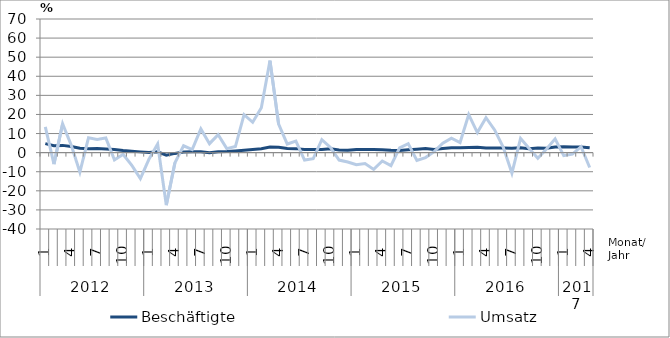
| Category | Beschäftigte | Umsatz |
|---|---|---|
| 0 | 4.7 | 13.5 |
| 1 | 3.6 | -6 |
| 2 | 3.8 | 15.1 |
| 3 | 3.2 | 3.9 |
| 4 | 2.3 | -10.2 |
| 5 | 2.1 | 7.8 |
| 6 | 2.2 | 6.9 |
| 7 | 1.9 | 7.7 |
| 8 | 1.7 | -3.8 |
| 9 | 1.1 | -0.9 |
| 10 | 0.7 | -6.6 |
| 11 | 0.4 | -13.6 |
| 12 | 0.1 | -3.4 |
| 13 | 0.4 | 4.5 |
| 14 | -1.3 | -27.5 |
| 15 | -0.4 | -5.3 |
| 16 | 0.3 | 3.6 |
| 17 | 0.4 | 1.6 |
| 18 | 0.4 | 12.4 |
| 19 | 0 | 4.7 |
| 20 | 0.5 | 9.4 |
| 21 | 0.6 | 2.1 |
| 22 | 0.9 | 3.2 |
| 23 | 1.2 | 19.9 |
| 24 | 1.6 | 15.9 |
| 25 | 2 | 23.5 |
| 26 | 2.9 | 48.2 |
| 27 | 2.8 | 14.9 |
| 28 | 2.2 | 4.5 |
| 29 | 2.1 | 6 |
| 30 | 1.6 | -3.9 |
| 31 | 1.6 | -3.2 |
| 32 | 1.6 | 6.8 |
| 33 | 2 | 2.7 |
| 34 | 1.4 | -3.9 |
| 35 | 1.3 | -4.9 |
| 36 | 1.7 | -6.3 |
| 37 | 1.7 | -5.7 |
| 38 | 1.7 | -8.8 |
| 39 | 1.5 | -4.4 |
| 40 | 1.2 | -6.8 |
| 41 | 1.1 | 2.5 |
| 42 | 1.5 | 4.7 |
| 43 | 1.8 | -4.1 |
| 44 | 2.1 | -2.6 |
| 45 | 1.6 | 0.5 |
| 46 | 2.2 | 4.9 |
| 47 | 2.6 | 7.6 |
| 48 | 2.5 | 5.3 |
| 49 | 2.7 | 19.9 |
| 50 | 2.8 | 10.5 |
| 51 | 2.4 | 18.3 |
| 52 | 2.4 | 11.9 |
| 53 | 2.4 | 2.8 |
| 54 | 2.3 | -10.7 |
| 55 | 2.5 | 7.5 |
| 56 | 2 | 2.2 |
| 57 | 2.4 | -2.9 |
| 58 | 2.3 | 1.9 |
| 59 | 2.9 | 7.2 |
| 60 | 3.1 | -1.6 |
| 61 | 3 | -0.8 |
| 62 | 3 | 3.1 |
| 63 | 2.5 | -7.8 |